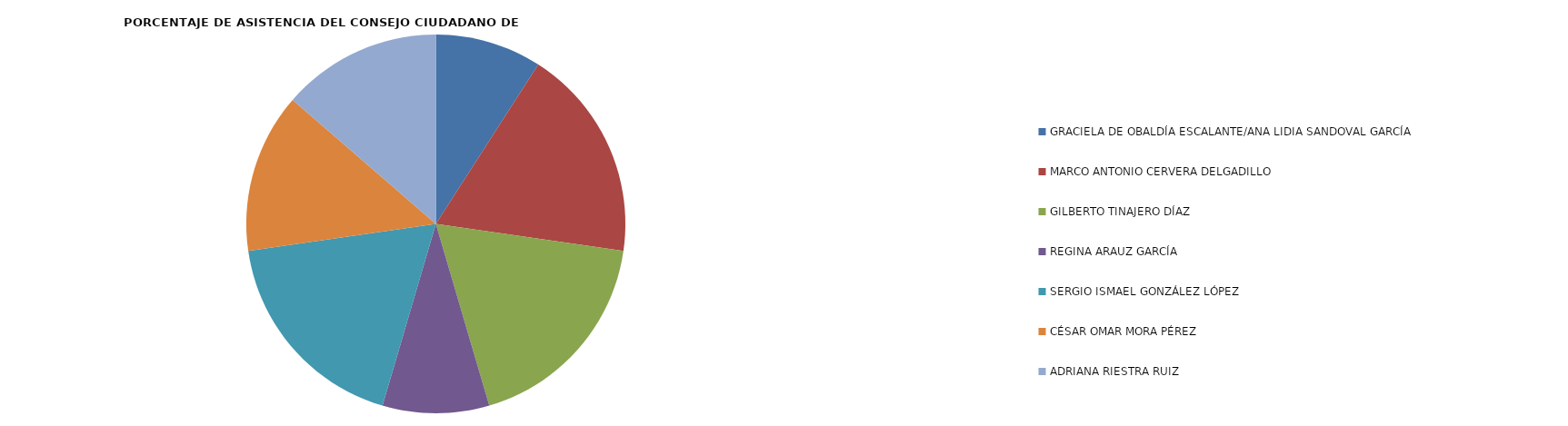
| Category | Series 0 |
|---|---|
| GRACIELA DE OBALDÍA ESCALANTE/ANA LIDIA SANDOVAL GARCÍA | 50 |
| MARCO ANTONIO CERVERA DELGADILLO | 100 |
| GILBERTO TINAJERO DÍAZ | 100 |
| REGINA ARAUZ GARCÍA | 50 |
| SERGIO ISMAEL GONZÁLEZ LÓPEZ | 100 |
| CÉSAR OMAR MORA PÉREZ | 75 |
| ADRIANA RIESTRA RUIZ | 75 |